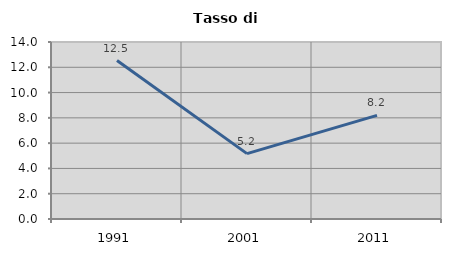
| Category | Tasso di disoccupazione   |
|---|---|
| 1991.0 | 12.533 |
| 2001.0 | 5.172 |
| 2011.0 | 8.195 |